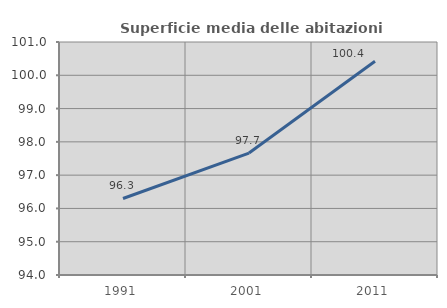
| Category | Superficie media delle abitazioni occupate |
|---|---|
| 1991.0 | 96.298 |
| 2001.0 | 97.664 |
| 2011.0 | 100.421 |